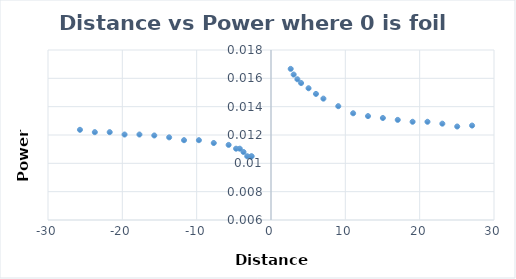
| Category | Series 0 |
|---|---|
| -25.7 | 0.012 |
| -23.7 | 0.012 |
| -21.7 | 0.012 |
| -19.7 | 0.012 |
| -17.7 | 0.012 |
| -15.7 | 0.012 |
| -13.7 | 0.012 |
| -11.7 | 0.012 |
| -9.7 | 0.012 |
| -7.7 | 0.011 |
| -5.7 | 0.011 |
| -4.7 | 0.011 |
| -4.2 | 0.011 |
| -3.7 | 0.011 |
| -3.2 | 0.01 |
| -2.7 | 0.01 |
| -2.5999999999999996 | 0.01 |
| 27.05 | 0.013 |
| 25.05 | 0.013 |
| 23.05 | 0.013 |
| 21.05 | 0.013 |
| 19.05 | 0.013 |
| 17.05 | 0.013 |
| 15.05 | 0.013 |
| 13.05 | 0.013 |
| 11.05 | 0.014 |
| 9.05 | 0.014 |
| 7.05 | 0.015 |
| 6.05 | 0.015 |
| 5.05 | 0.015 |
| 4.05 | 0.016 |
| 3.55 | 0.016 |
| 3.05 | 0.016 |
| 2.65 | 0.017 |